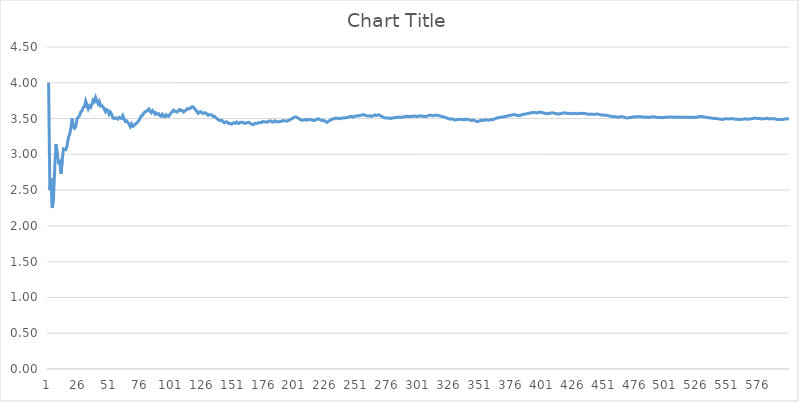
| Category | Series 0 |
|---|---|
| 0 | 4 |
| 1 | 2.5 |
| 2 | 2.667 |
| 3 | 2.25 |
| 4 | 2.4 |
| 5 | 2.833 |
| 6 | 3.143 |
| 7 | 3 |
| 8 | 2.889 |
| 9 | 2.9 |
| 10 | 2.727 |
| 11 | 2.917 |
| 12 | 3.077 |
| 13 | 3.071 |
| 14 | 3.067 |
| 15 | 3.125 |
| 16 | 3.235 |
| 17 | 3.278 |
| 18 | 3.368 |
| 19 | 3.5 |
| 20 | 3.381 |
| 21 | 3.364 |
| 22 | 3.391 |
| 23 | 3.5 |
| 24 | 3.52 |
| 25 | 3.538 |
| 26 | 3.593 |
| 27 | 3.607 |
| 28 | 3.655 |
| 29 | 3.667 |
| 30 | 3.742 |
| 31 | 3.688 |
| 32 | 3.636 |
| 33 | 3.676 |
| 34 | 3.657 |
| 35 | 3.694 |
| 36 | 3.757 |
| 37 | 3.737 |
| 38 | 3.795 |
| 39 | 3.75 |
| 40 | 3.707 |
| 41 | 3.738 |
| 42 | 3.674 |
| 43 | 3.682 |
| 44 | 3.667 |
| 45 | 3.63 |
| 46 | 3.596 |
| 47 | 3.625 |
| 48 | 3.612 |
| 49 | 3.56 |
| 50 | 3.588 |
| 51 | 3.558 |
| 52 | 3.509 |
| 53 | 3.5 |
| 54 | 3.509 |
| 55 | 3.5 |
| 56 | 3.491 |
| 57 | 3.517 |
| 58 | 3.508 |
| 59 | 3.5 |
| 60 | 3.541 |
| 61 | 3.5 |
| 62 | 3.46 |
| 63 | 3.469 |
| 64 | 3.446 |
| 65 | 3.424 |
| 66 | 3.388 |
| 67 | 3.426 |
| 68 | 3.391 |
| 69 | 3.4 |
| 70 | 3.423 |
| 71 | 3.431 |
| 72 | 3.452 |
| 73 | 3.473 |
| 74 | 3.507 |
| 75 | 3.539 |
| 76 | 3.545 |
| 77 | 3.577 |
| 78 | 3.595 |
| 79 | 3.6 |
| 80 | 3.617 |
| 81 | 3.634 |
| 82 | 3.602 |
| 83 | 3.583 |
| 84 | 3.612 |
| 85 | 3.593 |
| 86 | 3.563 |
| 87 | 3.58 |
| 88 | 3.562 |
| 89 | 3.567 |
| 90 | 3.538 |
| 91 | 3.533 |
| 92 | 3.559 |
| 93 | 3.532 |
| 94 | 3.526 |
| 95 | 3.552 |
| 96 | 3.536 |
| 97 | 3.531 |
| 98 | 3.556 |
| 99 | 3.58 |
| 100 | 3.594 |
| 101 | 3.618 |
| 102 | 3.602 |
| 103 | 3.596 |
| 104 | 3.59 |
| 105 | 3.613 |
| 106 | 3.626 |
| 107 | 3.611 |
| 108 | 3.615 |
| 109 | 3.591 |
| 110 | 3.604 |
| 111 | 3.616 |
| 112 | 3.637 |
| 113 | 3.632 |
| 114 | 3.643 |
| 115 | 3.647 |
| 116 | 3.667 |
| 117 | 3.661 |
| 118 | 3.639 |
| 119 | 3.617 |
| 120 | 3.595 |
| 121 | 3.574 |
| 122 | 3.593 |
| 123 | 3.597 |
| 124 | 3.576 |
| 125 | 3.571 |
| 126 | 3.583 |
| 127 | 3.578 |
| 128 | 3.566 |
| 129 | 3.546 |
| 130 | 3.557 |
| 131 | 3.553 |
| 132 | 3.549 |
| 133 | 3.53 |
| 134 | 3.533 |
| 135 | 3.515 |
| 136 | 3.504 |
| 137 | 3.486 |
| 138 | 3.475 |
| 139 | 3.471 |
| 140 | 3.475 |
| 141 | 3.458 |
| 142 | 3.441 |
| 143 | 3.451 |
| 144 | 3.455 |
| 145 | 3.438 |
| 146 | 3.429 |
| 147 | 3.432 |
| 148 | 3.423 |
| 149 | 3.433 |
| 150 | 3.444 |
| 151 | 3.434 |
| 152 | 3.451 |
| 153 | 3.435 |
| 154 | 3.432 |
| 155 | 3.449 |
| 156 | 3.446 |
| 157 | 3.449 |
| 158 | 3.434 |
| 159 | 3.431 |
| 160 | 3.441 |
| 161 | 3.444 |
| 162 | 3.448 |
| 163 | 3.433 |
| 164 | 3.424 |
| 165 | 3.416 |
| 166 | 3.419 |
| 167 | 3.435 |
| 168 | 3.432 |
| 169 | 3.435 |
| 170 | 3.444 |
| 171 | 3.442 |
| 172 | 3.445 |
| 173 | 3.46 |
| 174 | 3.451 |
| 175 | 3.455 |
| 176 | 3.452 |
| 177 | 3.449 |
| 178 | 3.464 |
| 179 | 3.467 |
| 180 | 3.464 |
| 181 | 3.451 |
| 182 | 3.454 |
| 183 | 3.467 |
| 184 | 3.454 |
| 185 | 3.457 |
| 186 | 3.455 |
| 187 | 3.457 |
| 188 | 3.46 |
| 189 | 3.468 |
| 190 | 3.471 |
| 191 | 3.469 |
| 192 | 3.466 |
| 193 | 3.464 |
| 194 | 3.477 |
| 195 | 3.48 |
| 196 | 3.492 |
| 197 | 3.5 |
| 198 | 3.513 |
| 199 | 3.52 |
| 200 | 3.522 |
| 201 | 3.515 |
| 202 | 3.502 |
| 203 | 3.49 |
| 204 | 3.483 |
| 205 | 3.476 |
| 206 | 3.478 |
| 207 | 3.481 |
| 208 | 3.488 |
| 209 | 3.476 |
| 210 | 3.488 |
| 211 | 3.486 |
| 212 | 3.484 |
| 213 | 3.481 |
| 214 | 3.474 |
| 215 | 3.472 |
| 216 | 3.484 |
| 217 | 3.491 |
| 218 | 3.498 |
| 219 | 3.486 |
| 220 | 3.48 |
| 221 | 3.473 |
| 222 | 3.475 |
| 223 | 3.469 |
| 224 | 3.458 |
| 225 | 3.447 |
| 226 | 3.458 |
| 227 | 3.469 |
| 228 | 3.48 |
| 229 | 3.491 |
| 230 | 3.498 |
| 231 | 3.496 |
| 232 | 3.506 |
| 233 | 3.504 |
| 234 | 3.506 |
| 235 | 3.5 |
| 236 | 3.498 |
| 237 | 3.508 |
| 238 | 3.506 |
| 239 | 3.508 |
| 240 | 3.51 |
| 241 | 3.517 |
| 242 | 3.514 |
| 243 | 3.525 |
| 244 | 3.531 |
| 245 | 3.528 |
| 246 | 3.518 |
| 247 | 3.528 |
| 248 | 3.534 |
| 249 | 3.536 |
| 250 | 3.538 |
| 251 | 3.54 |
| 252 | 3.545 |
| 253 | 3.547 |
| 254 | 3.553 |
| 255 | 3.555 |
| 256 | 3.545 |
| 257 | 3.539 |
| 258 | 3.537 |
| 259 | 3.535 |
| 260 | 3.54 |
| 261 | 3.531 |
| 262 | 3.536 |
| 263 | 3.545 |
| 264 | 3.551 |
| 265 | 3.541 |
| 266 | 3.547 |
| 267 | 3.552 |
| 268 | 3.543 |
| 269 | 3.533 |
| 270 | 3.524 |
| 271 | 3.515 |
| 272 | 3.509 |
| 273 | 3.507 |
| 274 | 3.509 |
| 275 | 3.504 |
| 276 | 3.509 |
| 277 | 3.5 |
| 278 | 3.509 |
| 279 | 3.511 |
| 280 | 3.509 |
| 281 | 3.518 |
| 282 | 3.516 |
| 283 | 3.521 |
| 284 | 3.516 |
| 285 | 3.517 |
| 286 | 3.523 |
| 287 | 3.521 |
| 288 | 3.526 |
| 289 | 3.534 |
| 290 | 3.526 |
| 291 | 3.531 |
| 292 | 3.529 |
| 293 | 3.527 |
| 294 | 3.529 |
| 295 | 3.534 |
| 296 | 3.535 |
| 297 | 3.53 |
| 298 | 3.528 |
| 299 | 3.537 |
| 300 | 3.532 |
| 301 | 3.54 |
| 302 | 3.535 |
| 303 | 3.53 |
| 304 | 3.531 |
| 305 | 3.526 |
| 306 | 3.534 |
| 307 | 3.542 |
| 308 | 3.547 |
| 309 | 3.548 |
| 310 | 3.54 |
| 311 | 3.538 |
| 312 | 3.546 |
| 313 | 3.548 |
| 314 | 3.546 |
| 315 | 3.541 |
| 316 | 3.539 |
| 317 | 3.531 |
| 318 | 3.533 |
| 319 | 3.525 |
| 320 | 3.52 |
| 321 | 3.516 |
| 322 | 3.508 |
| 323 | 3.5 |
| 324 | 3.495 |
| 325 | 3.491 |
| 326 | 3.495 |
| 327 | 3.491 |
| 328 | 3.483 |
| 329 | 3.479 |
| 330 | 3.486 |
| 331 | 3.488 |
| 332 | 3.486 |
| 333 | 3.491 |
| 334 | 3.49 |
| 335 | 3.482 |
| 336 | 3.49 |
| 337 | 3.482 |
| 338 | 3.49 |
| 339 | 3.491 |
| 340 | 3.484 |
| 341 | 3.477 |
| 342 | 3.472 |
| 343 | 3.477 |
| 344 | 3.475 |
| 345 | 3.468 |
| 346 | 3.461 |
| 347 | 3.457 |
| 348 | 3.464 |
| 349 | 3.471 |
| 350 | 3.479 |
| 351 | 3.472 |
| 352 | 3.476 |
| 353 | 3.483 |
| 354 | 3.482 |
| 355 | 3.478 |
| 356 | 3.476 |
| 357 | 3.483 |
| 358 | 3.487 |
| 359 | 3.483 |
| 360 | 3.49 |
| 361 | 3.497 |
| 362 | 3.504 |
| 363 | 3.511 |
| 364 | 3.512 |
| 365 | 3.516 |
| 366 | 3.52 |
| 367 | 3.522 |
| 368 | 3.526 |
| 369 | 3.527 |
| 370 | 3.531 |
| 371 | 3.538 |
| 372 | 3.542 |
| 373 | 3.543 |
| 374 | 3.547 |
| 375 | 3.553 |
| 376 | 3.552 |
| 377 | 3.556 |
| 378 | 3.549 |
| 379 | 3.542 |
| 380 | 3.546 |
| 381 | 3.542 |
| 382 | 3.548 |
| 383 | 3.555 |
| 384 | 3.561 |
| 385 | 3.56 |
| 386 | 3.566 |
| 387 | 3.57 |
| 388 | 3.573 |
| 389 | 3.574 |
| 390 | 3.581 |
| 391 | 3.584 |
| 392 | 3.58 |
| 393 | 3.586 |
| 394 | 3.582 |
| 395 | 3.578 |
| 396 | 3.584 |
| 397 | 3.588 |
| 398 | 3.591 |
| 399 | 3.585 |
| 400 | 3.579 |
| 401 | 3.575 |
| 402 | 3.568 |
| 403 | 3.567 |
| 404 | 3.573 |
| 405 | 3.571 |
| 406 | 3.577 |
| 407 | 3.581 |
| 408 | 3.579 |
| 409 | 3.573 |
| 410 | 3.569 |
| 411 | 3.568 |
| 412 | 3.562 |
| 413 | 3.568 |
| 414 | 3.569 |
| 415 | 3.575 |
| 416 | 3.576 |
| 417 | 3.581 |
| 418 | 3.578 |
| 419 | 3.574 |
| 420 | 3.57 |
| 421 | 3.573 |
| 422 | 3.572 |
| 423 | 3.566 |
| 424 | 3.569 |
| 425 | 3.573 |
| 426 | 3.569 |
| 427 | 3.568 |
| 428 | 3.571 |
| 429 | 3.574 |
| 430 | 3.571 |
| 431 | 3.572 |
| 432 | 3.57 |
| 433 | 3.574 |
| 434 | 3.57 |
| 435 | 3.564 |
| 436 | 3.563 |
| 437 | 3.559 |
| 438 | 3.563 |
| 439 | 3.561 |
| 440 | 3.56 |
| 441 | 3.561 |
| 442 | 3.56 |
| 443 | 3.563 |
| 444 | 3.562 |
| 445 | 3.558 |
| 446 | 3.555 |
| 447 | 3.549 |
| 448 | 3.552 |
| 449 | 3.547 |
| 450 | 3.545 |
| 451 | 3.546 |
| 452 | 3.543 |
| 453 | 3.537 |
| 454 | 3.534 |
| 455 | 3.529 |
| 456 | 3.527 |
| 457 | 3.526 |
| 458 | 3.527 |
| 459 | 3.522 |
| 460 | 3.521 |
| 461 | 3.519 |
| 462 | 3.525 |
| 463 | 3.526 |
| 464 | 3.525 |
| 465 | 3.521 |
| 466 | 3.516 |
| 467 | 3.511 |
| 468 | 3.507 |
| 469 | 3.511 |
| 470 | 3.516 |
| 471 | 3.515 |
| 472 | 3.52 |
| 473 | 3.525 |
| 474 | 3.522 |
| 475 | 3.525 |
| 476 | 3.524 |
| 477 | 3.525 |
| 478 | 3.528 |
| 479 | 3.523 |
| 480 | 3.524 |
| 481 | 3.519 |
| 482 | 3.522 |
| 483 | 3.517 |
| 484 | 3.522 |
| 485 | 3.519 |
| 486 | 3.517 |
| 487 | 3.52 |
| 488 | 3.524 |
| 489 | 3.524 |
| 490 | 3.521 |
| 491 | 3.52 |
| 492 | 3.515 |
| 493 | 3.516 |
| 494 | 3.515 |
| 495 | 3.516 |
| 496 | 3.511 |
| 497 | 3.516 |
| 498 | 3.517 |
| 499 | 3.518 |
| 500 | 3.519 |
| 501 | 3.52 |
| 502 | 3.521 |
| 503 | 3.524 |
| 504 | 3.521 |
| 505 | 3.518 |
| 506 | 3.521 |
| 507 | 3.516 |
| 508 | 3.521 |
| 509 | 3.522 |
| 510 | 3.517 |
| 511 | 3.518 |
| 512 | 3.517 |
| 513 | 3.521 |
| 514 | 3.517 |
| 515 | 3.519 |
| 516 | 3.516 |
| 517 | 3.519 |
| 518 | 3.514 |
| 519 | 3.517 |
| 520 | 3.518 |
| 521 | 3.519 |
| 522 | 3.514 |
| 523 | 3.519 |
| 524 | 3.518 |
| 525 | 3.523 |
| 526 | 3.528 |
| 527 | 3.527 |
| 528 | 3.531 |
| 529 | 3.526 |
| 530 | 3.522 |
| 531 | 3.517 |
| 532 | 3.52 |
| 533 | 3.515 |
| 534 | 3.51 |
| 535 | 3.507 |
| 536 | 3.507 |
| 537 | 3.506 |
| 538 | 3.501 |
| 539 | 3.5 |
| 540 | 3.499 |
| 541 | 3.498 |
| 542 | 3.495 |
| 543 | 3.493 |
| 544 | 3.49 |
| 545 | 3.487 |
| 546 | 3.492 |
| 547 | 3.496 |
| 548 | 3.495 |
| 549 | 3.496 |
| 550 | 3.495 |
| 551 | 3.495 |
| 552 | 3.497 |
| 553 | 3.498 |
| 554 | 3.495 |
| 555 | 3.491 |
| 556 | 3.492 |
| 557 | 3.489 |
| 558 | 3.485 |
| 559 | 3.488 |
| 560 | 3.49 |
| 561 | 3.489 |
| 562 | 3.492 |
| 563 | 3.496 |
| 564 | 3.492 |
| 565 | 3.491 |
| 566 | 3.494 |
| 567 | 3.495 |
| 568 | 3.496 |
| 569 | 3.5 |
| 570 | 3.503 |
| 571 | 3.507 |
| 572 | 3.504 |
| 573 | 3.502 |
| 574 | 3.503 |
| 575 | 3.502 |
| 576 | 3.497 |
| 577 | 3.493 |
| 578 | 3.497 |
| 579 | 3.498 |
| 580 | 3.501 |
| 581 | 3.503 |
| 582 | 3.499 |
| 583 | 3.495 |
| 584 | 3.499 |
| 585 | 3.498 |
| 586 | 3.497 |
| 587 | 3.497 |
| 588 | 3.492 |
| 589 | 3.488 |
| 590 | 3.486 |
| 591 | 3.488 |
| 592 | 3.486 |
| 593 | 3.49 |
| 594 | 3.487 |
| 595 | 3.492 |
| 596 | 3.496 |
| 597 | 3.498 |
| 598 | 3.496 |
| 599 | 3.495 |